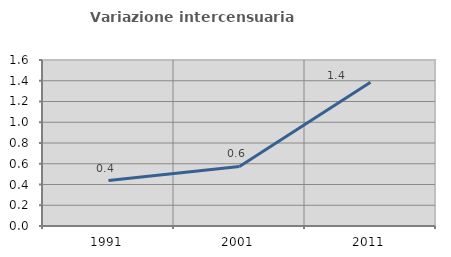
| Category | Variazione intercensuaria annua |
|---|---|
| 1991.0 | 0.438 |
| 2001.0 | 0.574 |
| 2011.0 | 1.387 |